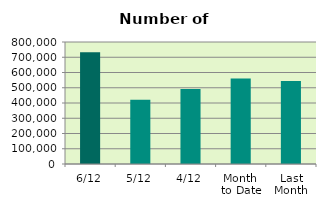
| Category | Series 0 |
|---|---|
| 6/12 | 732774 |
| 5/12 | 421810 |
| 4/12 | 491638 |
| Month 
to Date | 559925.5 |
| Last
Month | 544187.818 |